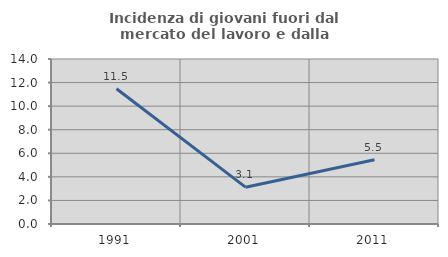
| Category | Incidenza di giovani fuori dal mercato del lavoro e dalla formazione  |
|---|---|
| 1991.0 | 11.48 |
| 2001.0 | 3.125 |
| 2011.0 | 5.455 |